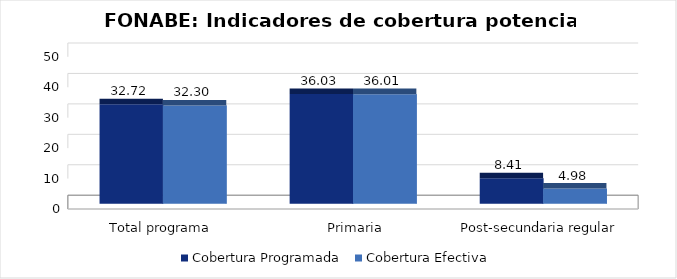
| Category | Cobertura Programada | Cobertura Efectiva |
|---|---|---|
| Total programa | 32.724 | 32.299 |
|   Primaria | 36.029 | 36.012 |
| Post-secundaria regular  | 8.411 | 4.98 |